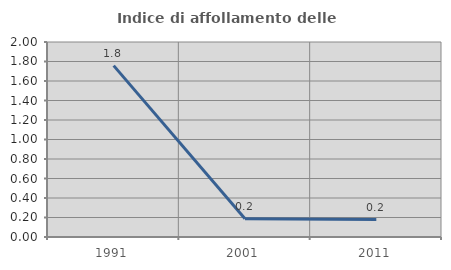
| Category | Indice di affollamento delle abitazioni  |
|---|---|
| 1991.0 | 1.757 |
| 2001.0 | 0.186 |
| 2011.0 | 0.178 |